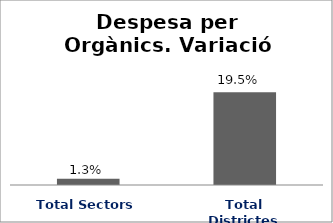
| Category | Series 0 |
|---|---|
| Total Sectors | 0.013 |
| Total Districtes | 0.195 |